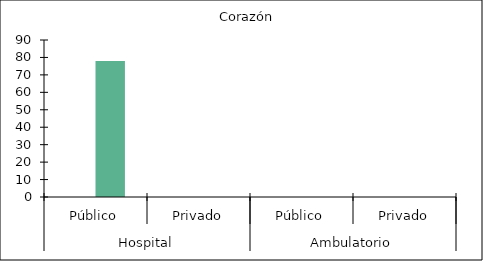
| Category |   |    Corazón |
|---|---|---|
| 0 | 0 | 78 |
| 1 | 0 | 0 |
| 2 | 0 | 0 |
| 3 | 0 | 0 |